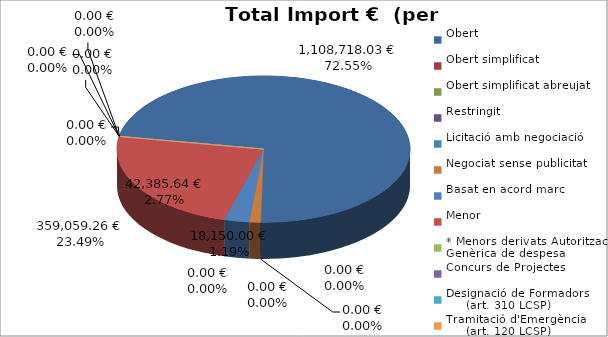
| Category | Total preu
(amb IVA) |
|---|---|
| Obert | 1108718.03 |
| Obert simplificat | 0 |
| Obert simplificat abreujat | 0 |
| Restringit | 0 |
| Licitació amb negociació | 0 |
| Negociat sense publicitat | 18150 |
| Basat en acord marc | 42385.64 |
| Menor | 359059.256 |
| * Menors derivats Autorització Genèrica de despesa | 0 |
| Concurs de Projectes | 0 |
| Designació de Formadors
     (art. 310 LCSP) | 0 |
| Tramitació d'Emergència
     (art. 120 LCSP) | 0 |